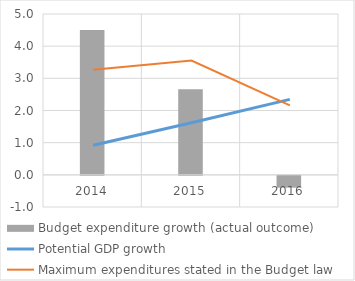
| Category | Budget expenditure growth (actual outcome) |
|---|---|
| 0 | 4.504 |
| 1 | 2.661 |
| 2 | -0.369 |